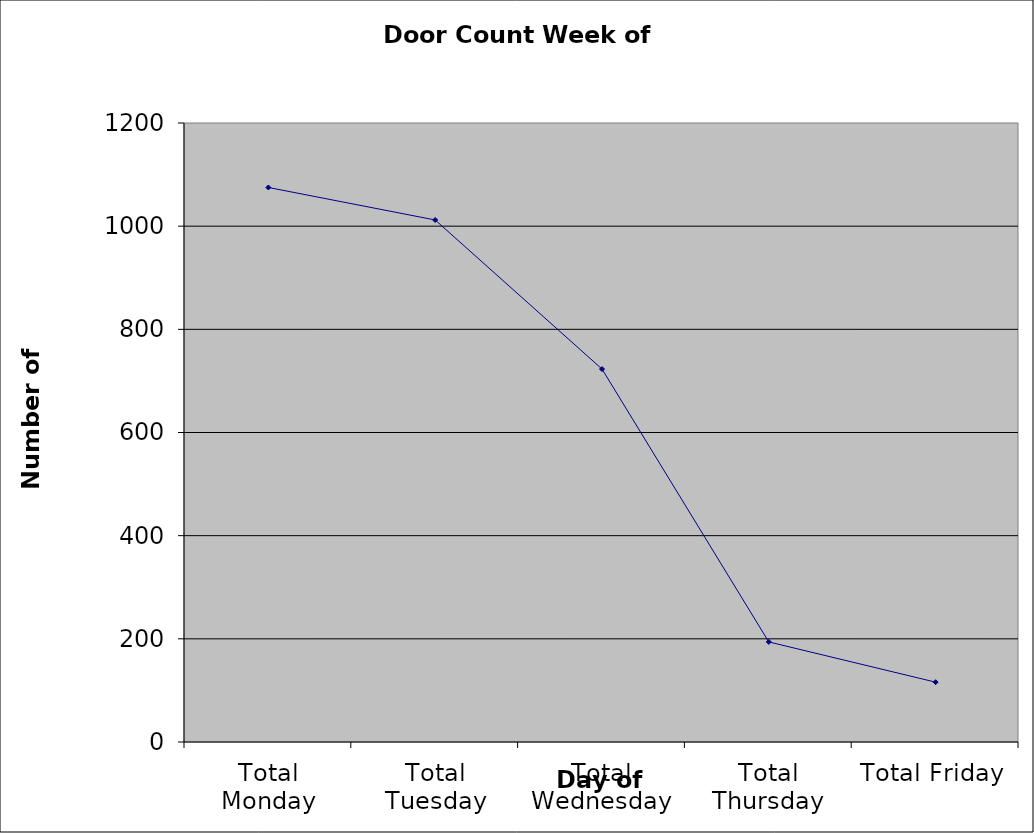
| Category | Series 0 |
|---|---|
| Total Monday | 1075 |
| Total Tuesday | 1012 |
| Total Wednesday | 723 |
| Total Thursday | 194 |
| Total Friday | 116 |